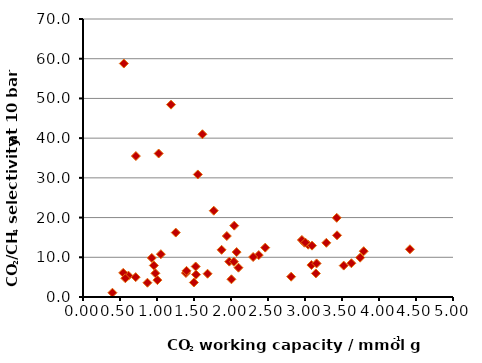
| Category | Series 0 |
|---|---|
| 2.00602366341196 | 4.461 |
| 3.288238382373522 | 13.647 |
| 0.6138502001406069 | 5.381 |
| 1.189486253840903 | 48.434 |
| 1.5230423619713775 | 7.683 |
| 1.5281993705128727 | 5.631 |
| 1.5512656559350384 | 30.853 |
| 0.543212640328943 | 6.081 |
| 3.0870181716368346 | 8.048 |
| 3.6268134662522504 | 8.505 |
| 3.042953592362622 | 13.169 |
| 2.3750423378565877 | 10.56 |
| 2.9926605019970323 | 13.675 |
| 4.418377992542152 | 12.015 |
| 1.6140266119765105 | 40.984 |
| 0.7147163966326517 | 35.486 |
| 0.5721139298081034 | 4.715 |
| 1.8728580827612302 | 11.874 |
| 1.0229318591360972 | 36.131 |
| 0.397824367992057 | 1.082 |
| 2.462395728048066 | 12.431 |
| 1.9430099707442652 | 15.352 |
| 3.793594737177514 | 11.534 |
| 3.0949190403637843 | 12.932 |
| 0.870999180218632 | 3.594 |
| 1.9771826451142405 | 8.909 |
| 1.3917587516034513 | 6.041 |
| 2.8128054761498653 | 5.116 |
| 0.551764769253352 | 58.784 |
| 2.958159305945979 | 14.364 |
| 1.6828803539389048 | 5.862 |
| 0.9295049160762794 | 9.829 |
| 1.005401763407671 | 4.252 |
| 3.4288830065809686 | 19.947 |
| 2.2993179356452185 | 10.065 |
| 3.7449109050389944 | 9.911 |
| 2.0439053382354384 | 17.963 |
| 0.7117871067163273 | 4.997 |
| 1.7669055910079408 | 21.729 |
| 2.076190405414566 | 11.31 |
| 1.05190835912158 | 10.783 |
| 3.5232295093685044 | 7.905 |
| 0.9781991951187777 | 5.964 |
| 3.1469828668800606 | 5.94 |
| 2.100672102197993 | 7.378 |
| 1.399016979879519 | 6.583 |
| 3.432910714428893 | 15.534 |
| 3.1564796426907953 | 8.455 |
| 3.0044630705380073 | 13.705 |
| 1.2538659603250357 | 16.223 |
| 2.0397236713874562 | 8.885 |
| 1.4986737640076861 | 3.651 |
| 0.9574157773502721 | 7.936 |